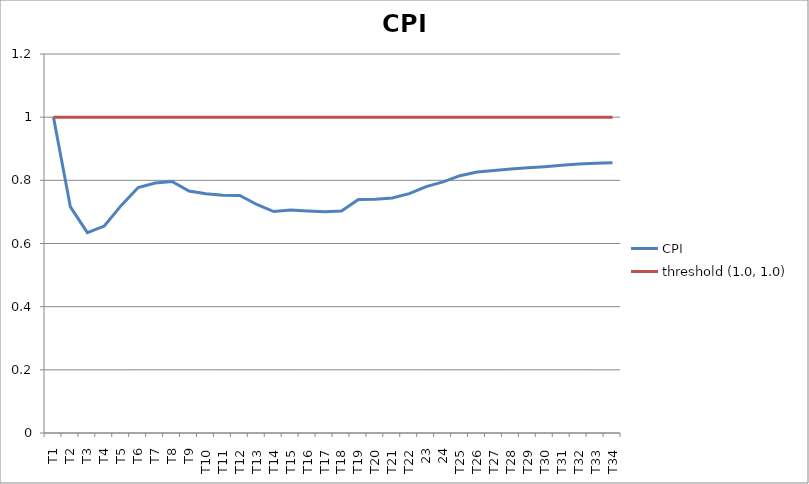
| Category | CPI | threshold (1.0, 1.0) |
|---|---|---|
| T1 | 1 | 1 |
| T2 | 0.716 | 1 |
| T3 | 0.634 | 1 |
| T4 | 0.655 | 1 |
| T5 | 0.721 | 1 |
| T6 | 0.777 | 1 |
| T7 | 0.791 | 1 |
| T8 | 0.797 | 1 |
| T9 | 0.766 | 1 |
| T10 | 0.758 | 1 |
| T11 | 0.753 | 1 |
| T12 | 0.752 | 1 |
| T13 | 0.724 | 1 |
| T14 | 0.701 | 1 |
| T15 | 0.706 | 1 |
| T16 | 0.703 | 1 |
| T17 | 0.701 | 1 |
| T18 | 0.703 | 1 |
| T19 | 0.739 | 1 |
| T20 | 0.74 | 1 |
| T21 | 0.744 | 1 |
| T22 | 0.758 | 1 |
| 23 | 0.78 | 1 |
| 24 | 0.795 | 1 |
| T25 | 0.815 | 1 |
| T26 | 0.826 | 1 |
| T27 | 0.831 | 1 |
| T28 | 0.836 | 1 |
| T29 | 0.839 | 1 |
| T30 | 0.843 | 1 |
| T31 | 0.847 | 1 |
| T32 | 0.851 | 1 |
| T33 | 0.854 | 1 |
| T34 | 0.855 | 1 |